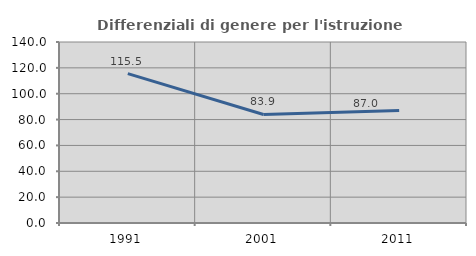
| Category | Differenziali di genere per l'istruzione superiore |
|---|---|
| 1991.0 | 115.516 |
| 2001.0 | 83.949 |
| 2011.0 | 87.034 |